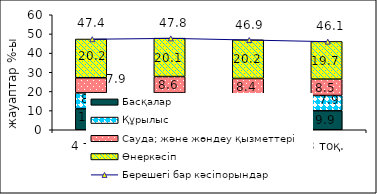
| Category | Басқалар | Құрылыс | Сауда; және жөндеу қызметтері | Өнеркәсіп |
|---|---|---|---|---|
| 4 тоқ. | 11.02 | 8.22 | 7.89 | 20.22 |
| 1 тоқ. 2008  | 10.86 | 8.35 | 8.55 | 20.05 |
| 2 тоқ. | 10.43 | 7.95 | 8.38 | 20.18 |
| 3 тоқ. | 9.93 | 7.94 | 8.54 | 19.68 |